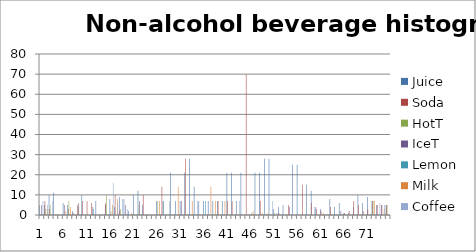
| Category | Juice | Soda | HotT | IceT | Lemon | Milk | Coffee |
|---|---|---|---|---|---|---|---|
| 0 | 5 | 0 | 0 | 5 | 0 | 0 | 7 |
| 1 | 5 | 7 | 3 | 0 | 0 | 3 | 5 |
| 2 | 10 | 3 | 5 | 0 | 0 | 0 | 7 |
| 3 | 11 | 0 | 0 | 0 | 0 | 0 | 0 |
| 4 | 0 | 0 | 0 | 0 | 0 | 0 | 0 |
| 5 | 6 | 0 | 0 | 5 | 0 | 2 | 0 |
| 6 | 5 | 3 | 7 | 0 | 0 | 4 | 0 |
| 7 | 2 | 1 | 0 | 0 | 0 | 0 | 0 |
| 8 | 0 | 5 | 4 | 6 | 0 | 0 | 0 |
| 9 | 10 | 7 | 0 | 0 | 0 | 0 | 0 |
| 10 | 0 | 7 | 0 | 0 | 0 | 0 | 0 |
| 11 | 0 | 6 | 0 | 4 | 3 | 0 | 0 |
| 12 | 7 | 0 | 0 | 0 | 0 | 0 | 0 |
| 13 | 0 | 0 | 0 | 0 | 0 | 0 | 0 |
| 14 | 5 | 6 | 10 | 0 | 0 | 0 | 0 |
| 15 | 8 | 0 | 2 | 0 | 0 | 5 | 16 |
| 16 | 4 | 10 | 0 | 0 | 0 | 8 | 6 |
| 17 | 9 | 2 | 3 | 0 | 0 | 0 | 8 |
| 18 | 8 | 0 | 0 | 5 | 0 | 0 | 3 |
| 19 | 2 | 0 | 0 | 0 | 0 | 1 | 0 |
| 20 | 10 | 0 | 0 | 0 | 0 | 0 | 0 |
| 21 | 12 | 0 | 5 | 7 | 0 | 0 | 0 |
| 22 | 5 | 10 | 0 | 0 | 0 | 0 | 0 |
| 23 | 0 | 0 | 0 | 0 | 0 | 0 | 0 |
| 24 | 0 | 0 | 0 | 0 | 0 | 0 | 0 |
| 25 | 7 | 0 | 7 | 0 | 0 | 7 | 0 |
| 26 | 0 | 14 | 0 | 7 | 7 | 0 | 0 |
| 27 | 0 | 0 | 0 | 0 | 0 | 0 | 7 |
| 28 | 21 | 0 | 0 | 0 | 0 | 0 | 0 |
| 29 | 7 | 0 | 0 | 0 | 0 | 14 | 0 |
| 30 | 7 | 0 | 0 | 7 | 0 | 0 | 0 |
| 31 | 21 | 28 | 0 | 0 | 0 | 0 | 0 |
| 32 | 28 | 0 | 0 | 0 | 0 | 7 | 0 |
| 33 | 14 | 0 | 0 | 0 | 0 | 0 | 7 |
| 34 | 7 | 0 | 0 | 0 | 0 | 0 | 0 |
| 35 | 7 | 0 | 0 | 0 | 7 | 0 | 0 |
| 36 | 7 | 0 | 0 | 0 | 0 | 14 | 0 |
| 37 | 7 | 0 | 0 | 0 | 0 | 7 | 0 |
| 38 | 7 | 7 | 0 | 0 | 0 | 0 | 0 |
| 39 | 7 | 0 | 0 | 0 | 0 | 7 | 0 |
| 40 | 21 | 7 | 0 | 0 | 0 | 0 | 0 |
| 41 | 21 | 7 | 0 | 0 | 0 | 0 | 0 |
| 42 | 7 | 0 | 0 | 0 | 0 | 0 | 7 |
| 43 | 21 | 0 | 0 | 0 | 0 | 0 | 0 |
| 44 | 0 | 70 | 0 | 0 | 0 | 0 | 0 |
| 45 | 0 | 0 | 1 | 0 | 0 | 2 | 0 |
| 46 | 21 | 0 | 0 | 0 | 0 | 0 | 0 |
| 47 | 21 | 7 | 0 | 0 | 0 | 1 | 0 |
| 48 | 28 | 0 | 0 | 0 | 0 | 1 | 0 |
| 49 | 28 | 0 | 0 | 0 | 0 | 0 | 7 |
| 50 | 3 | 0 | 1 | 0 | 0 | 0 | 1 |
| 51 | 4 | 1 | 0 | 0 | 0 | 0 | 0 |
| 52 | 5 | 0 | 0 | 0 | 0 | 0 | 0 |
| 53 | 0 | 5 | 0 | 4 | 0 | 0 | 0 |
| 54 | 25 | 0 | 0 | 0 | 0 | 0 | 0 |
| 55 | 25 | 0 | 0 | 0 | 0 | 0 | 0 |
| 56 | 0 | 15 | 0 | 0 | 0 | 0 | 0 |
| 57 | 15 | 0 | 0 | 0 | 0 | 0 | 0 |
| 58 | 12 | 6 | 0 | 0 | 0 | 0 | 4 |
| 59 | 4 | 3 | 0 | 0 | 0 | 0 | 0 |
| 60 | 3 | 2 | 0 | 0 | 0 | 1 | 0 |
| 61 | 0 | 0 | 0 | 0 | 0 | 0 | 0 |
| 62 | 8 | 4 | 0 | 0 | 0 | 0 | 0 |
| 63 | 4 | 0 | 0 | 0 | 0 | 0 | 0 |
| 64 | 6 | 0 | 0 | 2 | 0 | 0 | 0 |
| 65 | 1 | 1 | 0 | 0 | 0 | 0 | 0 |
| 66 | 1 | 2 | 0 | 0 | 0 | 0 | 0 |
| 67 | 4 | 7 | 0 | 0 | 0 | 0 | 0 |
| 68 | 10 | 5 | 0 | 0 | 0 | 0 | 0 |
| 69 | 6 | 2 | 0 | 0 | 0 | 0 | 0 |
| 70 | 9 | 3 | 0 | 0 | 0 | 0 | 0 |
| 71 | 7 | 7 | 7 | 0 | 0 | 7 | 0 |
| 72 | 5 | 5 | 0 | 0 | 0 | 0 | 6 |
| 73 | 5 | 5 | 0 | 0 | 0 | 3 | 5 |
| 74 | 5 | 5 | 5 | 0 | 0 | 0 | 0 |